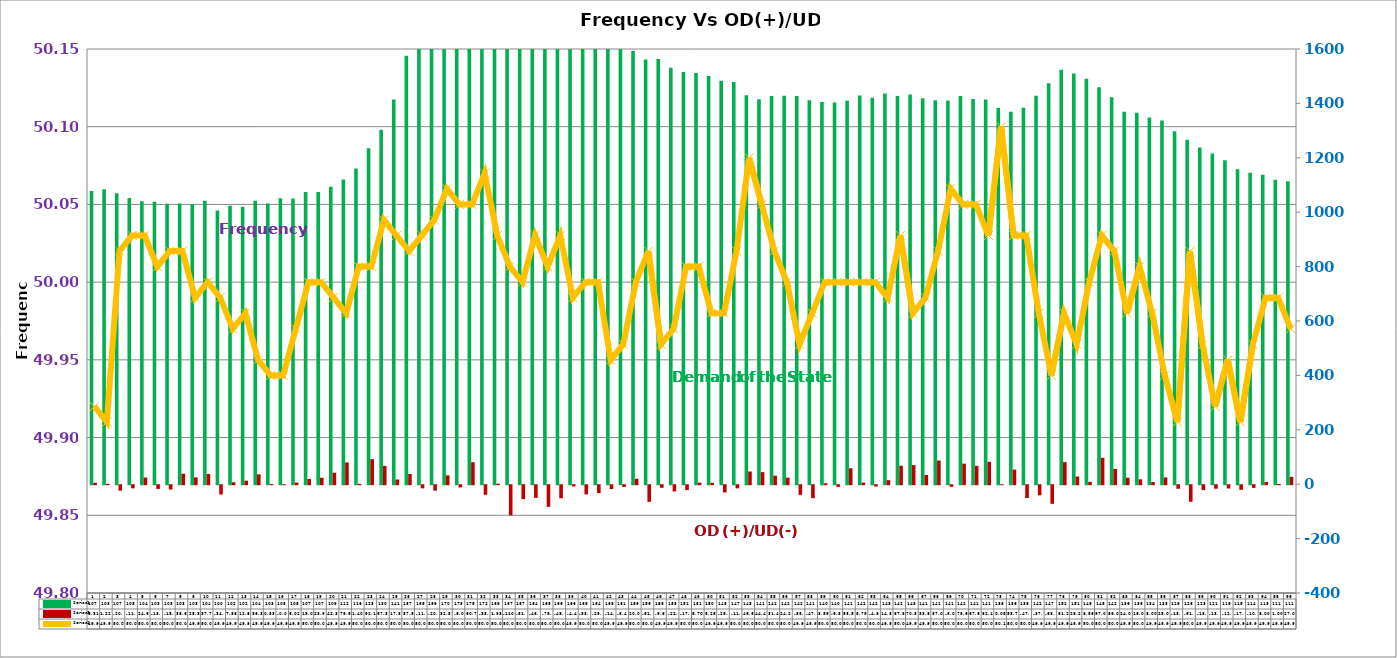
| Category | Series 2 | Series 4 |
|---|---|---|
| 0 | 1078 | 5.313 |
| 1 | 1084 | 1.224 |
| 2 | 1070 | -20.095 |
| 3 | 1052 | -11.538 |
| 4 | 1040 | 24.64 |
| 5 | 1038 | -13.749 |
| 6 | 1031 | -15.904 |
| 7 | 1032 | 38.623 |
| 8 | 1030 | 25.379 |
| 9 | 1042 | 37.712 |
| 10 | 1006 | -34.222 |
| 11 | 1024 | 7.378 |
| 12 | 1020 | 12.823 |
| 13 | 1042 | 36.363 |
| 14 | 1032 | 0.528 |
| 15 | 1051 | -0.092 |
| 16 | 1050 | 6.018 |
| 17 | 1074 | 19.038 |
| 18 | 1074 | 23.938 |
| 19 | 1094 | 42.317 |
| 20 | 1120 | 79.973 |
| 21 | 1161 | 1.401 |
| 22 | 1235 | 92.166 |
| 23 | 1303 | 67.338 |
| 24 | 1414 | 17.343 |
| 25 | 1575 | 37.574 |
| 26 | 1655 | -11.59 |
| 27 | 1695 | -20.125 |
| 28 | 1706 | 32.571 |
| 29 | 1739 | -8.091 |
| 30 | 1759 | 80.742 |
| 31 | 1728 | -35.264 |
| 32 | 1691 | 1.927 |
| 33 | 1675 | -110.826 |
| 34 | 1675 | -51.321 |
| 35 | 1648.467 | -46.428 |
| 36 | 1653 | -79.464 |
| 37 | 1663 | -48.124 |
| 38 | 1665 | -4.456 |
| 39 | 1665 | -33.716 |
| 40 | 1647 | -29.234 |
| 41 | 1630 | -14.089 |
| 42 | 1613 | -6.479 |
| 43 | 1593 | 20.063 |
| 44 | 1561 | -61.322 |
| 45 | 1563 | -9.636 |
| 46 | 1531 | -22.98 |
| 47 | 1515 | -17.885 |
| 48 | 1512 | 5.696 |
| 49 | 1501 | 5.256 |
| 50 | 1483 | -26.57 |
| 51 | 1479 | -11.52 |
| 52 | 1430 | 46.67 |
| 53 | 1415 | 44.41 |
| 54 | 1427 | 31.471 |
| 55 | 1428 | 24.221 |
| 56 | 1427 | -35.538 |
| 57 | 1412 | -47.794 |
| 58 | 1405 | 3.591 |
| 59 | 1403 | -6.319 |
| 60 | 1410 | 58.581 |
| 61 | 1429 | 5.79 |
| 62 | 1421 | -4.826 |
| 63 | 1436 | 14.828 |
| 64 | 1427 | 67.927 |
| 65 | 1433 | 70.355 |
| 66 | 1419 | 33.889 |
| 67 | 1412 | 87.08 |
| 68 | 1411 | -6.019 |
| 69 | 1427 | 75.625 |
| 70 | 1416 | 67.629 |
| 71 | 1414 | 82.179 |
| 72 | 1383 | 0.051 |
| 73 | 1369 | 53.718 |
| 74 | 1384 | -47.303 |
| 75 | 1428 | -37.174 |
| 76 | 1474 | -68.588 |
| 77 | 1524 | 81.242 |
| 78 | 1510 | 28.272 |
| 79 | 1491 | 8.559 |
| 80 | 1459 | 97 |
| 81 | 1423 | 56 |
| 82 | 1369 | 24 |
| 83 | 1366 | 18 |
| 84 | 1348.333 | 8 |
| 85 | 1337 | 25 |
| 86 | 1298 | -13 |
| 87 | 1266 | -61 |
| 88 | 1238 | -18 |
| 89 | 1216 | -13 |
| 90 | 1191 | -12 |
| 91 | 1158 | -17 |
| 92 | 1145 | -10 |
| 93 | 1138 | 8 |
| 94 | 1119 | 1 |
| 95 | 1114 | 27 |